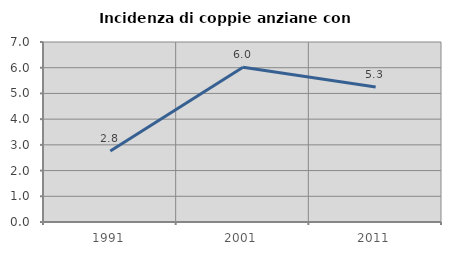
| Category | Incidenza di coppie anziane con figli |
|---|---|
| 1991.0 | 2.759 |
| 2001.0 | 6.019 |
| 2011.0 | 5.253 |